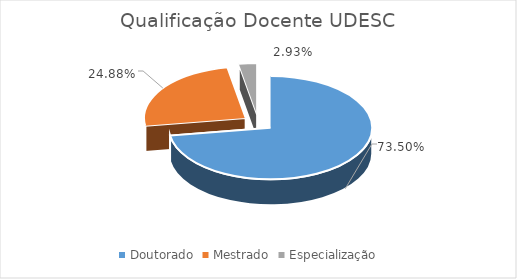
| Category | Series 0 |
|---|---|
| Doutorado | 0.735 |
| Mestrado | 0.249 |
| Especialização | 0.029 |